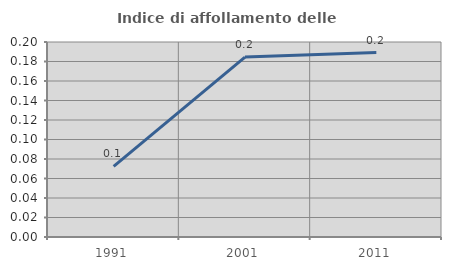
| Category | Indice di affollamento delle abitazioni  |
|---|---|
| 1991.0 | 0.072 |
| 2001.0 | 0.185 |
| 2011.0 | 0.189 |